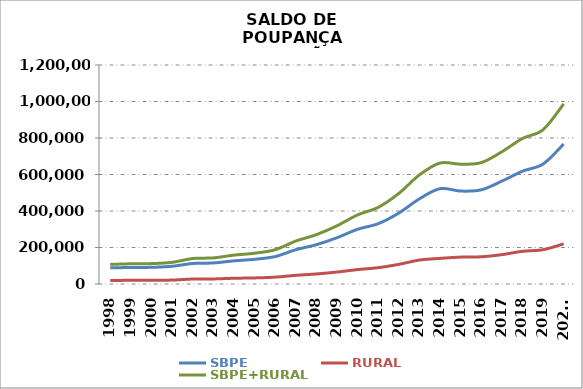
| Category | SBPE | RURAL | SBPE+RURAL |
|---|---|---|---|
| 1998 | 88538.349 | 18883.24 | 107421.589 |
| 1999 | 90437.74 | 20294.123 | 110731.863 |
| 2000 | 91430.45 | 20310.891 | 111741.341 |
| 2001 | 97146.25 | 21552.598 | 118698.848 |
| 2002 | 112423.444 | 27219.068 | 139642.512 |
| 2003 | 115258.021 | 27799.406 | 143057.427 |
| 2004 | 126853.217 | 31413.354 | 158266.571 |
| 2005 | 135411.681 | 33322.74 | 168734.421 |
| 2006 | 150412.546 | 37523.193 | 187935.739 |
| 2007 | 187827.264 | 47434.388 | 235261.652 |
| 2008 | 215400.282 | 54995.458 | 270395.74 |
| 2009 | 253604.98 | 65477.998 | 319082.978 |
| 2010 | 299878.217 | 78920.574 | 378798.791 |
| 2011 | 330569.272 | 89439.722 | 420008.994 |
| 2012 | 388641.662 | 107660.772 | 496302.434 |
| 2013 | 466788.644 | 131154.416 | 597943.06 |
| 2014 | 522343.501 | 140383.609 | 662727.11 |
| 2015 | 509223.044 | 147366.727 | 656589.771 |
| 2016 | 515955.43 | 149036.994 | 664992.424 |
| 2017 | 563741.675 | 160861.771 | 724603.446 |
| 2018 | 618146.063 | 179134.939 | 797281.002 |
| 2019 | 657531.442 | 187933.103 | 845464.545 |
| 2020* | 766816.29 | 219963.571 | 986779.861 |